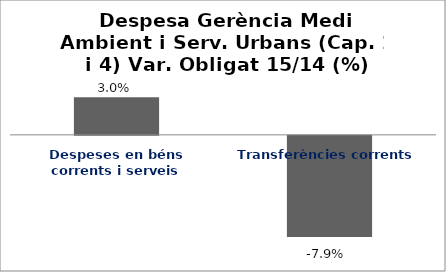
| Category | Series 0 |
|---|---|
| Despeses en béns corrents i serveis | 0.03 |
| Transferències corrents | -0.079 |